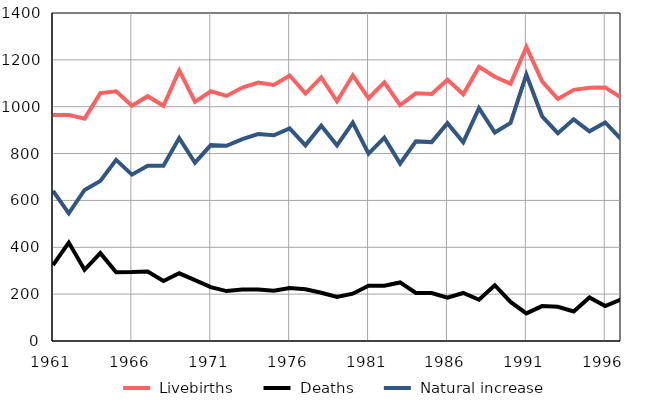
| Category |  Livebirths |  Deaths |  Natural increase |
|---|---|---|---|
| 1961.0 | 965 | 324 | 641 |
| 1962.0 | 965 | 420 | 545 |
| 1963.0 | 949 | 304 | 645 |
| 1964.0 | 1058 | 375 | 683 |
| 1965.0 | 1066 | 293 | 773 |
| 1966.0 | 1004 | 294 | 710 |
| 1967.0 | 1045 | 297 | 748 |
| 1968.0 | 1004 | 256 | 748 |
| 1969.0 | 1155 | 289 | 866 |
| 1970.0 | 1021 | 260 | 761 |
| 1971.0 | 1066 | 230 | 836 |
| 1972.0 | 1046 | 213 | 833 |
| 1973.0 | 1082 | 220 | 862 |
| 1974.0 | 1103 | 220 | 883 |
| 1975.0 | 1093 | 215 | 878 |
| 1976.0 | 1133 | 226 | 907 |
| 1977.0 | 1056 | 221 | 835 |
| 1978.0 | 1125 | 206 | 919 |
| 1979.0 | 1023 | 188 | 835 |
| 1980.0 | 1134 | 202 | 932 |
| 1981.0 | 1036 | 236 | 800 |
| 1982.0 | 1104 | 236 | 868 |
| 1983.0 | 1007 | 250 | 757 |
| 1984.0 | 1057 | 205 | 852 |
| 1985.0 | 1054 | 205 | 849 |
| 1986.0 | 1115 | 185 | 930 |
| 1987.0 | 1053 | 205 | 848 |
| 1988.0 | 1170 | 176 | 994 |
| 1989.0 | 1128 | 238 | 890 |
| 1990.0 | 1098 | 167 | 931 |
| 1991.0 | 1255 | 118 | 1137 |
| 1992.0 | 1108 | 149 | 959 |
| 1993.0 | 1033 | 146 | 887 |
| 1994.0 | 1072 | 126 | 946 |
| 1995.0 | 1081 | 186 | 895 |
| 1996.0 | 1082 | 149 | 933 |
| 1997.0 | 1039 | 177 | 862 |